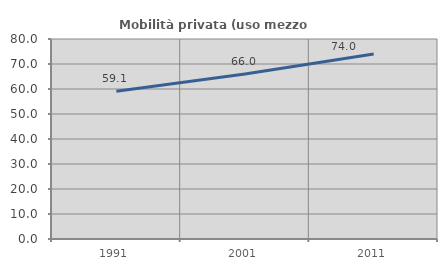
| Category | Mobilità privata (uso mezzo privato) |
|---|---|
| 1991.0 | 59.058 |
| 2001.0 | 65.998 |
| 2011.0 | 74.008 |